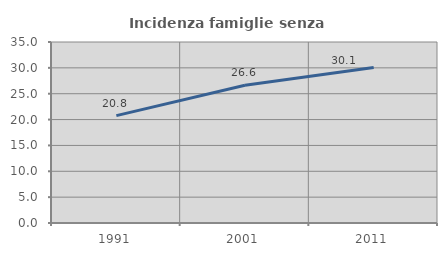
| Category | Incidenza famiglie senza nuclei |
|---|---|
| 1991.0 | 20.768 |
| 2001.0 | 26.64 |
| 2011.0 | 30.052 |